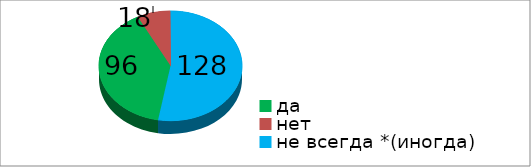
| Category | Series 0 |
|---|---|
| да | 96 |
| нет | 18 |
| не всегда *(иногда) | 128 |